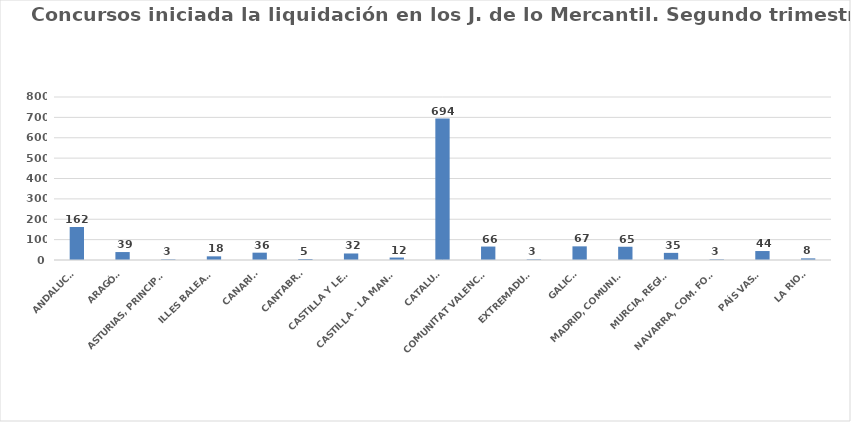
| Category | Series 0 |
|---|---|
| ANDALUCÍA | 162 |
| ARAGÓN | 39 |
| ASTURIAS, PRINCIPADO | 3 |
| ILLES BALEARS | 18 |
| CANARIAS | 36 |
| CANTABRIA | 5 |
| CASTILLA Y LEÓN | 32 |
| CASTILLA - LA MANCHA | 12 |
| CATALUÑA | 694 |
| COMUNITAT VALENCIANA | 66 |
| EXTREMADURA | 3 |
| GALICIA | 67 |
| MADRID, COMUNIDAD | 65 |
| MURCIA, REGIÓN | 35 |
| NAVARRA, COM. FORAL | 3 |
| PAÍS VASCO | 44 |
| LA RIOJA | 8 |